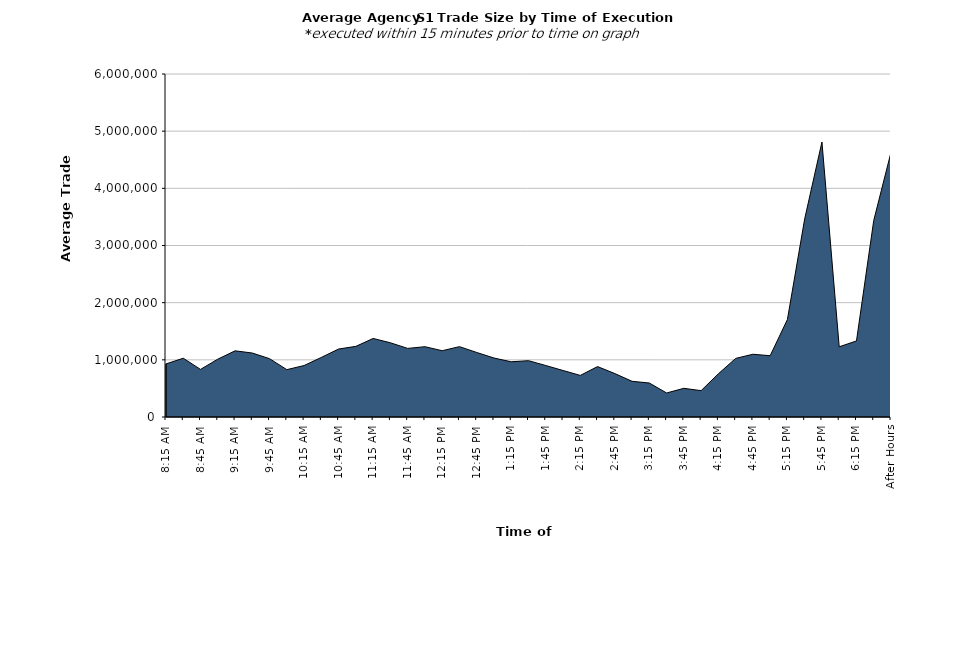
| Category | Series 0 |
|---|---|
| 8:15 AM | 928516.327 |
| 8:30 AM | 1028241.909 |
| 8:45 AM | 832711.774 |
| 9:00 AM | 1011777.098 |
| 9:15 AM | 1157438.638 |
| 9:30 AM | 1119197.327 |
| 9:45 AM | 1020126.918 |
| 10:00 AM | 828700.396 |
| 10:15 AM | 900375.024 |
| 10:30 AM | 1042290.972 |
| 10:45 AM | 1189170.355 |
| 11:00 AM | 1235501.134 |
| 11:15 AM | 1374012.496 |
| 11:30 AM | 1298437.348 |
| 11:45 AM | 1200053.215 |
| 12:00 PM | 1229951.401 |
| 12:15 PM | 1159486.336 |
| 12:30 PM | 1230882.694 |
| 12:45 PM | 1128877.441 |
| 1:00 PM | 1032022.227 |
| 1:15 PM | 965458.108 |
| 1:30 PM | 985281.493 |
| 1:45 PM | 900624.258 |
| 2:00 PM | 813657.195 |
| 2:15 PM | 727807.66 |
| 2:30 PM | 881824.243 |
| 2:45 PM | 760083.735 |
| 3:00 PM | 624283.072 |
| 3:15 PM | 594344.408 |
| 3:30 PM | 420276.052 |
| 3:45 PM | 501671.349 |
| 4:00 PM | 461293.646 |
| 4:15 PM | 755949.202 |
| 4:30 PM | 1024876.362 |
| 4:45 PM | 1097740.648 |
| 5:00 PM | 1072222.266 |
| 5:15 PM | 1706495.767 |
| 5:30 PM | 3466525.115 |
| 5:45 PM | 4810869.212 |
| 6:00 PM | 1228160.788 |
| 6:15 PM | 1330400.662 |
| 6:30 PM | 3438386.166 |
| After Hours | 4630422.055 |